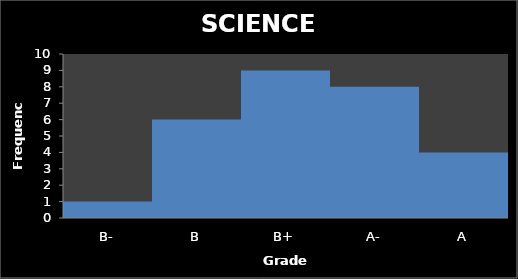
| Category | Series 0 |
|---|---|
| B- | 1 |
| B | 6 |
| B+ | 9 |
| A- | 8 |
| A | 4 |